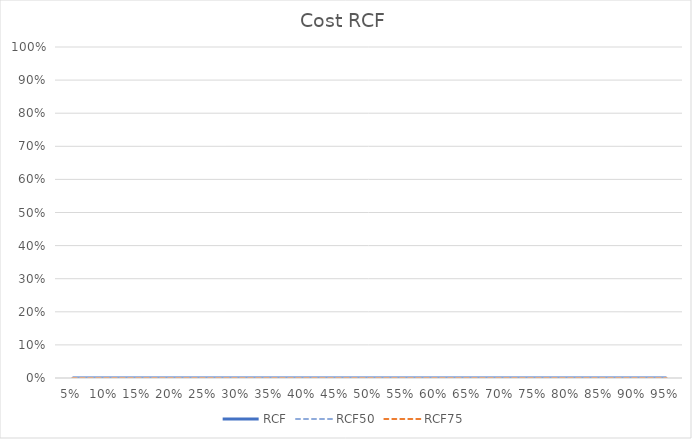
| Category | RCF | RCF50 | RCF75 |
|---|---|---|---|
| 0.05 | 0 | 0 | 0 |
| 0.1 | 0 | 0 | 0 |
| 0.15 | 0 | 0 | 0 |
| 0.2 | 0 | 0 | 0 |
| 0.25 | 0 | 0 | 0 |
| 0.3 | 0 | 0 | 0 |
| 0.35 | 0 | 0 | 0 |
| 0.4 | 0 | 0 | 0 |
| 0.45 | 0 | 0 | 0 |
| 0.5 | 0 | 0 | 0 |
| 0.55 | 0 | 0 | 0 |
| 0.6 | 0 | 0 | 0 |
| 0.65 | 0 | 0 | 0 |
| 0.7 | 0 | 0 | 0 |
| 0.75 | 0 | 0 | 0 |
| 0.8 | 0 | 0 | 0 |
| 0.85 | 0 | 0 | 0 |
| 0.9 | 0 | 0 | 0 |
| 0.95 | 0 | 0 | 0 |